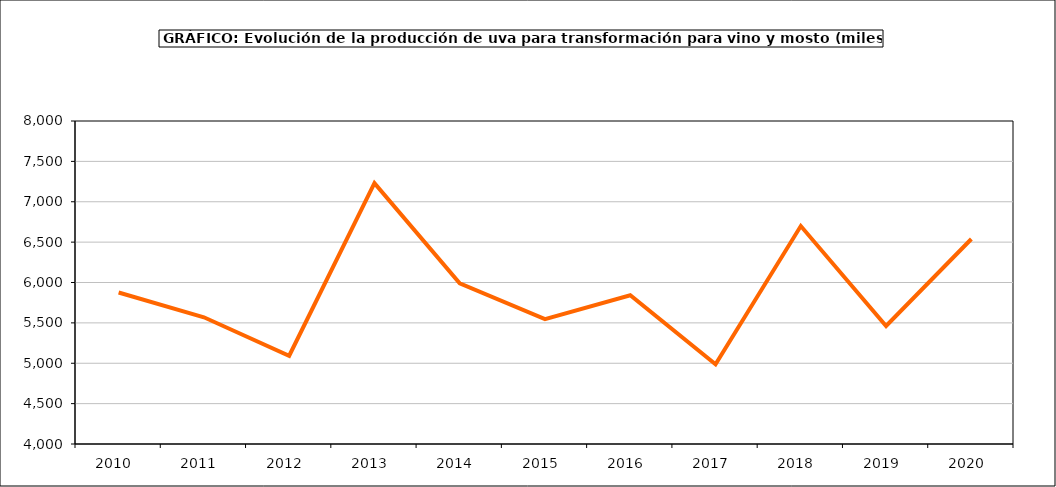
| Category | producción |
|---|---|
| 2010.0 | 5875.65 |
| 2011.0 | 5569.073 |
| 2012.0 | 5092.752 |
| 2013.0 | 7230.832 |
| 2014.0 | 5989.046 |
| 2015.0 | 5547.235 |
| 2016.0 | 5842.604 |
| 2017.0 | 4987.215 |
| 2018.0 | 6699.512 |
| 2019.0 | 5461.92 |
| 2020.0 | 6538.914 |